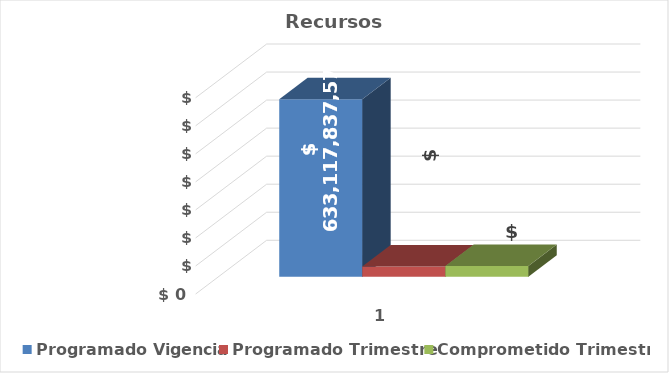
| Category | Programado Vigencia | Programado Trimestre | Comprometido Trimestre |
|---|---|---|---|
| 0 | 633117837570 | 36337194653 | 38455077381.66 |